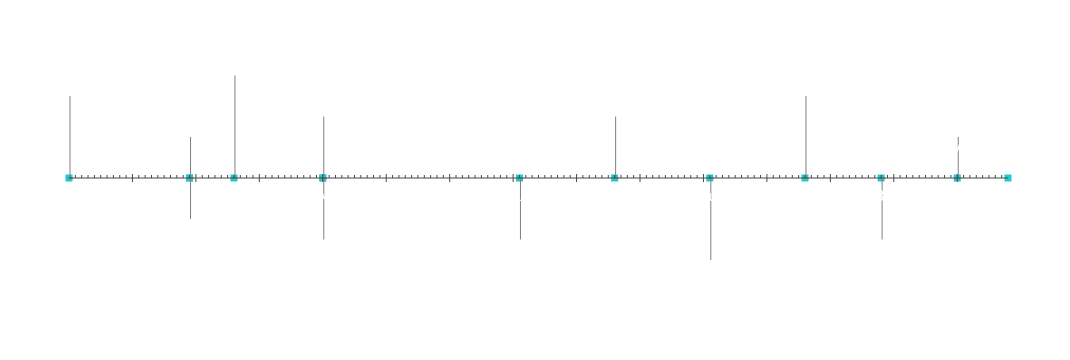
| Category | Θέση |
|---|---|
| Έναρξη έργου | 20 |
| Ορόσημο 1 | 10 |
| Ορόσημο 2 | -10 |
| Ορόσημο 3 | 25 |
| Ορόσημο 4 | -15 |
| Ορόσημο 5 | 15 |
| Ορόσημο 6 | -15 |
| Ορόσημο 7 | 15 |
| Ορόσημο 8 | -20 |
| Ορόσημο 9 | 20 |
| Ορόσημο 10 | -15 |
| Ορόσημο 11 | 10 |
| Λήξη έργου | 5 |